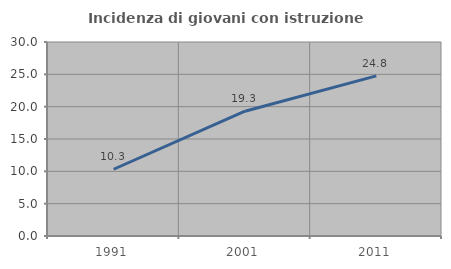
| Category | Incidenza di giovani con istruzione universitaria |
|---|---|
| 1991.0 | 10.323 |
| 2001.0 | 19.298 |
| 2011.0 | 24.762 |